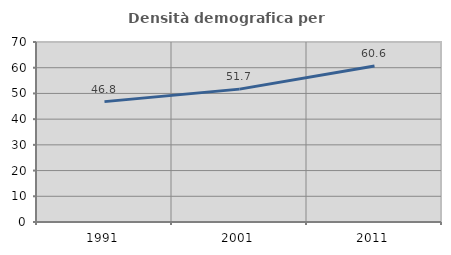
| Category | Densità demografica |
|---|---|
| 1991.0 | 46.814 |
| 2001.0 | 51.674 |
| 2011.0 | 60.628 |